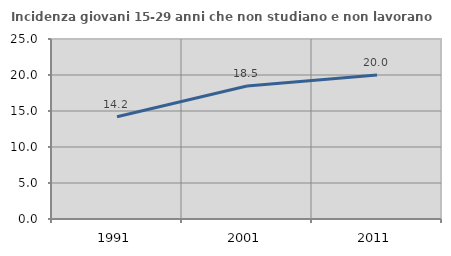
| Category | Incidenza giovani 15-29 anni che non studiano e non lavorano  |
|---|---|
| 1991.0 | 14.198 |
| 2001.0 | 18.462 |
| 2011.0 | 20 |